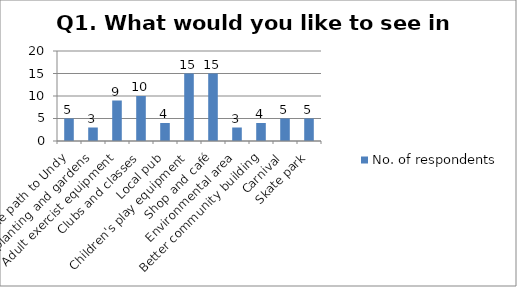
| Category | No. of respondents |
|---|---|
| Cycle path to Undy | 5 |
| Tree planting and gardens | 3 |
| Adult exercist equipment | 9 |
| Clubs and classes | 10 |
| Local pub | 4 |
| Children's play equipment | 15 |
| Shop and café | 15 |
| Environmental area | 3 |
| Better community building | 4 |
| Carnival | 5 |
| Skate park | 5 |